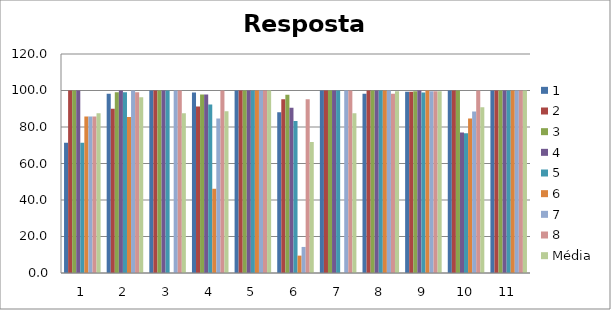
| Category | 1 | 2 | 3 | 4 | 5 | 6 | 7 | 8 | Média |
|---|---|---|---|---|---|---|---|---|---|
| 0 | 71.43 | 100 | 100 | 100 | 71.43 | 85.72 | 85.72 | 85.72 | 87.503 |
| 1 | 98.18 | 90 | 99.09 | 100 | 99.09 | 85.46 | 100 | 99.09 | 96.364 |
| 2 | 100 | 100 | 100 | 100 | 100 | 0 | 100 | 100 | 87.5 |
| 3 | 98.9 | 91.21 | 97.8 | 97.8 | 92.31 | 46.15 | 84.61 | 100 | 88.598 |
| 4 | 100 | 100 | 100 | 100 | 100 | 100 | 100 | 100 | 100 |
| 5 | 88.1 | 95.23 | 97.62 | 90.48 | 83.34 | 9.52 | 14.28 | 95.24 | 71.726 |
| 6 | 100 | 100 | 100 | 100 | 100 | 0 | 100 | 100 | 87.5 |
| 7 | 98.24 | 100 | 100 | 100 | 100 | 100 | 100 | 98.24 | 99.56 |
| 8 | 99.3 | 99.31 | 99.65 | 100 | 98.96 | 100 | 99.65 | 99.65 | 99.565 |
| 9 | 100 | 100 | 100 | 76.92 | 76.52 | 84.62 | 88.46 | 100 | 90.815 |
| 10 | 100 | 100 | 100 | 100 | 100 | 100 | 100 | 100 | 100 |